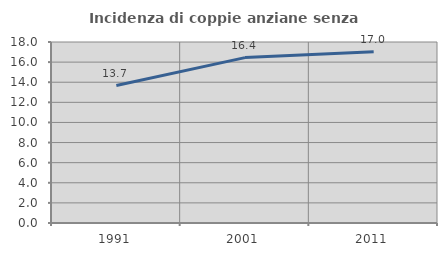
| Category | Incidenza di coppie anziane senza figli  |
|---|---|
| 1991.0 | 13.673 |
| 2001.0 | 16.447 |
| 2011.0 | 17.031 |